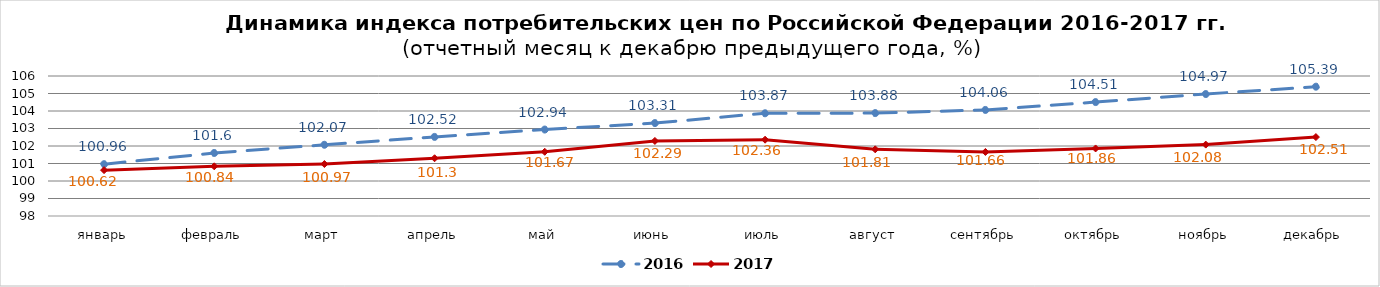
| Category | 2016 | 2017 |
|---|---|---|
| январь | 100.96 | 100.62 |
| февраль | 101.6 | 100.84 |
| март | 102.07 | 100.97 |
| апрель | 102.52 | 101.3 |
| май | 102.94 | 101.67 |
| июнь | 103.31 | 102.29 |
| июль | 103.87 | 102.36 |
| август | 103.88 | 101.81 |
| сентябрь | 104.06 | 101.66 |
| октябрь | 104.51 | 101.86 |
| ноябрь | 104.97 | 102.08 |
| декабрь | 105.39 | 102.51 |